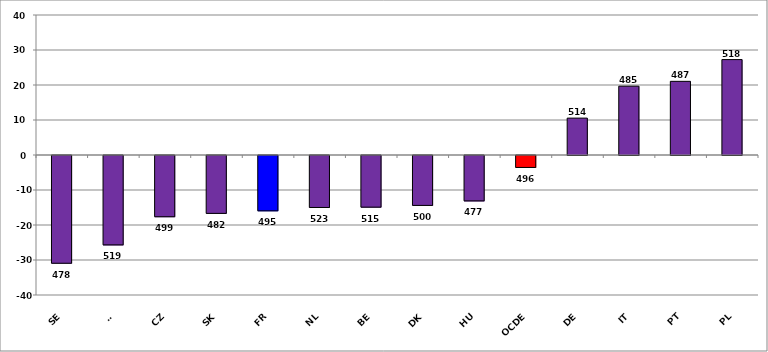
| Category | Series 0 |
|---|---|
| SE | -30.786 |
| FI | -25.539 |
| CZ | -17.497 |
| SK | -16.539 |
| FR | -15.815 |
| NL | -14.852 |
| BE | -14.757 |
| DK | -14.261 |
| HU | -12.968 |
| OCDE | -3.417 |
| DE | 10.54 |
| IT | 19.657 |
| PT | 21.046 |
| PL | 27.262 |